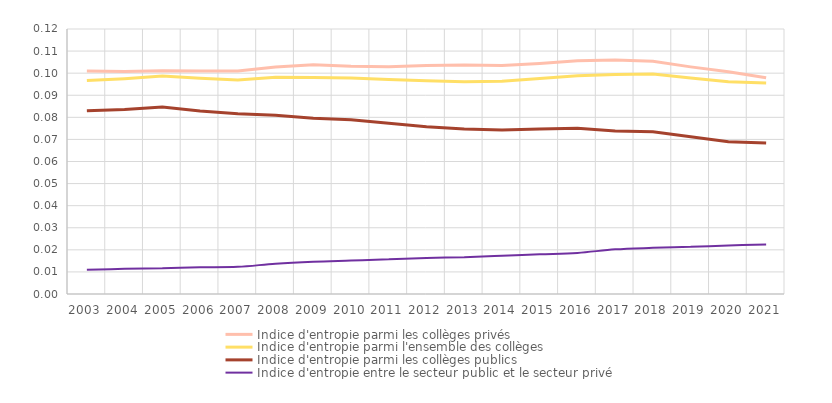
| Category | Indice d'entropie parmi les collèges privés | Indice d'entropie parmi l'ensemble des collèges | Indice d'entropie parmi les collèges publics | Indice d'entropie entre le secteur public et le secteur privé |
|---|---|---|---|---|
| 2003.0 | 0.101 | 0.097 | 0.083 | 0.011 |
| 2004.0 | 0.101 | 0.097 | 0.084 | 0.011 |
| 2005.0 | 0.101 | 0.099 | 0.085 | 0.012 |
| 2006.0 | 0.101 | 0.098 | 0.083 | 0.012 |
| 2007.0 | 0.101 | 0.097 | 0.082 | 0.012 |
| 2008.0 | 0.103 | 0.098 | 0.081 | 0.014 |
| 2009.0 | 0.104 | 0.098 | 0.08 | 0.015 |
| 2010.0 | 0.103 | 0.098 | 0.079 | 0.015 |
| 2011.0 | 0.103 | 0.097 | 0.077 | 0.016 |
| 2012.0 | 0.103 | 0.097 | 0.076 | 0.016 |
| 2013.0 | 0.104 | 0.096 | 0.075 | 0.017 |
| 2014.0 | 0.103 | 0.096 | 0.074 | 0.017 |
| 2015.0 | 0.104 | 0.098 | 0.075 | 0.018 |
| 2016.0 | 0.106 | 0.099 | 0.075 | 0.019 |
| 2017.0 | 0.106 | 0.099 | 0.074 | 0.02 |
| 2018.0 | 0.105 | 0.1 | 0.073 | 0.021 |
| 2019.0 | 0.103 | 0.098 | 0.071 | 0.021 |
| 2020.0 | 0.101 | 0.096 | 0.069 | 0.022 |
| 2021.0 | 0.098 | 0.096 | 0.068 | 0.022 |